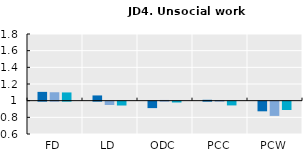
| Category | 2005 | 2010 | 2015 |
|---|---|---|---|
| FD | 1.106 | 1.101 | 1.099 |
| LD | 1.063 | 0.96 | 0.954 |
| ODC | 0.923 | 1.009 | 0.99 |
| PCC | 1.01 | 1.007 | 0.955 |
| PCW | 0.884 | 0.829 | 0.9 |